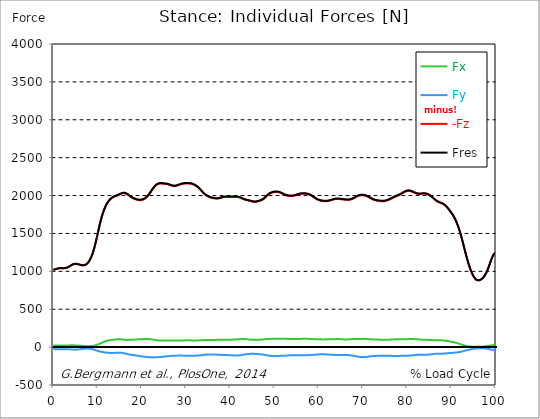
| Category |  Fx |  Fy |  -Fz |  Fres |
|---|---|---|---|---|
| 0.0 | 21.63 | -25.8 | 1021.29 | 1021.92 |
| 0.167348456675344 | 21.66 | -26.13 | 1022.79 | 1023.43 |
| 0.334696913350688 | 21.7 | -26.58 | 1024.83 | 1025.47 |
| 0.5020453700260321 | 21.77 | -27.16 | 1027.46 | 1028.12 |
| 0.669393826701376 | 21.85 | -27.84 | 1030.63 | 1031.31 |
| 0.83674228337672 | 21.93 | -28.56 | 1034.21 | 1034.91 |
| 1.0040907400520642 | 22 | -29.17 | 1037.46 | 1038.18 |
| 1.1621420602454444 | 22.04 | -29.54 | 1039.81 | 1040.54 |
| 1.3294905169207885 | 22.06 | -29.68 | 1041.31 | 1042.05 |
| 1.4968389735961325 | 22.04 | -29.63 | 1042.07 | 1042.8 |
| 1.6641874302714765 | 22 | -29.42 | 1042.23 | 1042.95 |
| 1.8315358869468206 | 21.93 | -29.1 | 1041.96 | 1042.67 |
| 1.9988843436221646 | 21.84 | -28.69 | 1041.45 | 1042.15 |
| 2.1662328002975086 | 21.76 | -28.25 | 1041.04 | 1041.73 |
| 2.333581256972853 | 21.71 | -27.82 | 1041.05 | 1041.74 |
| 2.5009297136481967 | 21.72 | -27.43 | 1041.68 | 1042.36 |
| 2.6682781703235405 | 21.78 | -27.11 | 1043.03 | 1043.7 |
| 2.8356266269988843 | 21.88 | -26.92 | 1045.14 | 1045.81 |
| 3.002975083674229 | 22.04 | -26.91 | 1047.96 | 1048.63 |
| 3.1703235403495724 | 22.25 | -27.13 | 1051.43 | 1052.12 |
| 3.337671997024917 | 22.48 | -27.54 | 1055.49 | 1056.18 |
| 3.4957233172182973 | 22.71 | -28.11 | 1060.13 | 1060.84 |
| 3.663071773893641 | 22.93 | -28.83 | 1065.39 | 1066.12 |
| 3.8304202305689854 | 23.15 | -29.67 | 1071.31 | 1072.06 |
| 3.997768687244329 | 23.38 | -30.61 | 1077.79 | 1078.57 |
| 4.165117143919673 | 23.53 | -31.54 | 1084.15 | 1084.96 |
| 4.332465600595017 | 23.56 | -32.34 | 1089.74 | 1090.57 |
| 4.499814057270361 | 23.47 | -32.94 | 1094.05 | 1094.89 |
| 4.667162513945706 | 23.26 | -33.3 | 1097.01 | 1097.86 |
| 4.834510970621049 | 22.94 | -33.44 | 1098.69 | 1099.54 |
| 5.001859427296393 | 22.52 | -33.35 | 1099.2 | 1100.04 |
| 5.169207883971737 | 22.03 | -33.03 | 1098.68 | 1099.49 |
| 5.336556340647081 | 21.46 | -32.51 | 1097.3 | 1098.09 |
| 5.503904797322425 | 20.86 | -31.79 | 1095.24 | 1096 |
| 5.671253253997769 | 20.23 | -30.89 | 1092.68 | 1093.41 |
| 5.82930457419115 | 19.57 | -29.83 | 1089.82 | 1090.51 |
| 5.996653030866494 | 18.88 | -28.66 | 1086.83 | 1087.48 |
| 6.164001487541838 | 18.15 | -27.44 | 1083.9 | 1084.51 |
| 6.331349944217181 | 17.39 | -26.19 | 1081.38 | 1081.95 |
| 6.498698400892526 | 16.64 | -24.95 | 1079.59 | 1080.12 |
| 6.66604685756787 | 15.89 | -23.76 | 1078.83 | 1079.32 |
| 6.833395314243213 | 15.17 | -22.63 | 1079.2 | 1079.66 |
| 7.000743770918558 | 14.49 | -21.6 | 1080.83 | 1081.26 |
| 7.168092227593902 | 13.89 | -20.75 | 1083.97 | 1084.38 |
| 7.335440684269246 | 13.37 | -20.1 | 1088.76 | 1089.15 |
| 7.50278914094459 | 12.95 | -19.69 | 1095.33 | 1095.71 |
| 7.6701375976199335 | 12.67 | -19.55 | 1103.87 | 1104.24 |
| 7.837486054295278 | 12.51 | -19.7 | 1114.48 | 1114.86 |
| 7.995537374488658 | 12.51 | -20.16 | 1127.26 | 1127.65 |
| 8.162885831164003 | 12.66 | -20.93 | 1142.34 | 1142.75 |
| 8.330234287839346 | 13.02 | -22.08 | 1159.97 | 1160.41 |
| 8.49758274451469 | 13.6 | -23.61 | 1180.3 | 1180.78 |
| 8.664931201190035 | 14.46 | -25.48 | 1203.41 | 1203.93 |
| 8.832279657865378 | 15.63 | -27.68 | 1229.36 | 1229.95 |
| 8.999628114540721 | 17.14 | -30.17 | 1258.19 | 1258.86 |
| 9.166976571216066 | 19.01 | -32.94 | 1290.03 | 1290.79 |
| 9.334325027891412 | 21.25 | -35.97 | 1325.11 | 1325.97 |
| 9.501673484566755 | 23.85 | -39.21 | 1363.34 | 1364.33 |
| 9.669021941242098 | 26.75 | -42.54 | 1404.23 | 1405.35 |
| 9.836370397917442 | 29.94 | -45.86 | 1447.05 | 1448.3 |
| 10.003718854592787 | 33.37 | -49.05 | 1490.9 | 1492.3 |
| 10.17106731126813 | 37.01 | -52.05 | 1534.81 | 1536.35 |
| 10.329118631461512 | 40.87 | -54.84 | 1578.02 | 1579.72 |
| 10.496467088136853 | 44.93 | -57.42 | 1619.72 | 1621.57 |
| 10.663815544812199 | 49.11 | -59.78 | 1659.08 | 1661.09 |
| 10.831164001487544 | 53.43 | -61.96 | 1695.86 | 1698.03 |
| 10.998512458162887 | 57.81 | -64 | 1729.85 | 1732.19 |
| 11.16586091483823 | 62.21 | -65.87 | 1761.02 | 1763.54 |
| 11.333209371513574 | 66.55 | -67.56 | 1789.52 | 1792.21 |
| 11.50055782818892 | 70.72 | -69.04 | 1815.5 | 1818.36 |
| 11.667906284864264 | 74.67 | -70.34 | 1839.12 | 1842.14 |
| 11.835254741539607 | 78.28 | -71.5 | 1860.61 | 1863.8 |
| 12.00260319821495 | 81.49 | -72.56 | 1879.99 | 1883.32 |
| 12.169951654890292 | 84.33 | -73.54 | 1897.31 | 1900.76 |
| 12.337300111565641 | 86.82 | -74.45 | 1912.64 | 1916.22 |
| 12.504648568240984 | 88.99 | -75.27 | 1926.14 | 1929.84 |
| 12.662699888434362 | 90.88 | -75.95 | 1938.01 | 1941.8 |
| 12.830048345109708 | 92.45 | -76.43 | 1948.44 | 1952.32 |
| 12.997396801785053 | 93.74 | -76.77 | 1957.64 | 1961.59 |
| 13.164745258460396 | 94.87 | -77.07 | 1965.69 | 1969.7 |
| 13.33209371513574 | 95.88 | -77.22 | 1972.64 | 1976.7 |
| 13.499442171811083 | 96.84 | -77.18 | 1978.57 | 1982.67 |
| 13.666790628486426 | 97.86 | -76.89 | 1983.54 | 1987.68 |
| 13.834139085161771 | 99.02 | -76.33 | 1987.69 | 1991.86 |
| 14.001487541837117 | 100.33 | -75.55 | 1991.19 | 1995.4 |
| 14.16883599851246 | 101.68 | -74.65 | 1994.39 | 1998.62 |
| 14.336184455187803 | 102.76 | -73.82 | 1997.86 | 2002.11 |
| 14.503532911863147 | 103.45 | -73.18 | 2001.83 | 2006.08 |
| 14.670881368538492 | 103.75 | -72.79 | 2006.24 | 2010.47 |
| 14.828932688731873 | 103.78 | -72.72 | 2010.9 | 2015.1 |
| 14.996281145407215 | 103.67 | -72.92 | 2015.61 | 2019.8 |
| 15.163629602082558 | 103.38 | -73.31 | 2020.34 | 2024.52 |
| 15.330978058757903 | 102.67 | -73.99 | 2024.95 | 2029.1 |
| 15.498326515433247 | 101.63 | -75.13 | 2028.9 | 2033.04 |
| 15.665674972108594 | 100.38 | -76.71 | 2031.76 | 2035.9 |
| 15.833023428783937 | 99.05 | -78.65 | 2033.2 | 2037.37 |
| 16.00037188545928 | 97.83 | -80.85 | 2033.13 | 2037.33 |
| 16.167720342134626 | 96.79 | -83.25 | 2031.56 | 2035.82 |
| 16.335068798809967 | 96.02 | -85.74 | 2028.55 | 2032.9 |
| 16.502417255485312 | 95.51 | -88.22 | 2024.24 | 2028.69 |
| 16.669765712160658 | 95.27 | -90.59 | 2018.74 | 2023.3 |
| 16.837114168836 | 95.28 | -92.82 | 2012.17 | 2016.85 |
| 17.004462625511344 | 95.48 | -94.94 | 2004.87 | 2009.68 |
| 17.16251394570472 | 95.79 | -96.98 | 1997.36 | 2002.31 |
| 17.32986240238007 | 96.15 | -98.93 | 1990.07 | 1995.16 |
| 17.497210859055414 | 96.57 | -100.75 | 1983.11 | 1988.33 |
| 17.664559315730756 | 97.06 | -102.38 | 1976.64 | 1981.98 |
| 17.8319077724061 | 97.59 | -103.81 | 1970.78 | 1976.25 |
| 17.999256229081443 | 98.1 | -105.04 | 1965.56 | 1971.13 |
| 18.166604685756788 | 98.55 | -106.18 | 1960.89 | 1966.56 |
| 18.333953142432133 | 98.99 | -107.36 | 1956.66 | 1962.42 |
| 18.501301599107478 | 99.51 | -108.63 | 1952.78 | 1958.64 |
| 18.668650055782823 | 100.1 | -110.03 | 1949.21 | 1955.2 |
| 18.835998512458165 | 100.74 | -111.48 | 1946.02 | 1952.13 |
| 19.00334696913351 | 101.4 | -112.98 | 1943.27 | 1949.5 |
| 19.170695425808855 | 102.06 | -114.6 | 1941.08 | 1947.45 |
| 19.338043882484197 | 102.71 | -116.32 | 1939.56 | 1946.06 |
| 19.496095202677576 | 103.29 | -118.13 | 1938.79 | 1945.43 |
| 19.66344365935292 | 103.78 | -119.94 | 1938.78 | 1945.55 |
| 19.830792116028263 | 104.25 | -121.6 | 1939.56 | 1946.45 |
| 19.998140572703612 | 104.72 | -122.97 | 1941.23 | 1948.22 |
| 20.165489029378953 | 105.13 | -124.1 | 1943.77 | 1950.83 |
| 20.3328374860543 | 105.5 | -125.16 | 1947.25 | 1954.39 |
| 20.500185942729644 | 105.83 | -126.26 | 1951.82 | 1959.02 |
| 20.667534399404985 | 106.11 | -127.44 | 1957.51 | 1964.78 |
| 20.83488285608033 | 106.39 | -128.68 | 1964.29 | 1971.63 |
| 21.002231312755672 | 106.65 | -129.91 | 1972.13 | 1979.53 |
| 21.16957976943102 | 106.75 | -130.95 | 1981.1 | 1988.53 |
| 21.336928226106362 | 106.59 | -131.73 | 1991.36 | 1998.79 |
| 21.504276682781704 | 106.16 | -132.28 | 2002.92 | 2010.33 |
| 21.67162513945705 | 105.52 | -132.72 | 2015.71 | 2023.06 |
| 21.82967645965043 | 104.71 | -133.06 | 2029.58 | 2036.86 |
| 21.997024916325774 | 103.7 | -133.29 | 2044.23 | 2051.42 |
| 22.16437337300112 | 102.52 | -133.42 | 2059.3 | 2066.41 |
| 22.33172182967646 | 101.15 | -133.47 | 2074.31 | 2081.31 |
| 22.499070286351806 | 99.55 | -133.43 | 2088.69 | 2095.57 |
| 22.666418743027148 | 97.83 | -133.34 | 2102.06 | 2108.82 |
| 22.833767199702496 | 96.06 | -133.24 | 2114.16 | 2120.79 |
| 23.00111565637784 | 94.3 | -133.16 | 2124.84 | 2131.35 |
| 23.168464113053183 | 92.57 | -133.09 | 2134.03 | 2140.43 |
| 23.335812569728528 | 91.05 | -132.98 | 2141.71 | 2148.01 |
| 23.50316102640387 | 89.78 | -132.79 | 2147.86 | 2154.07 |
| 23.670509483079215 | 88.79 | -132.47 | 2152.52 | 2158.65 |
| 23.83785793975456 | 88.09 | -132 | 2155.82 | 2161.88 |
| 23.995909259947936 | 87.59 | -131.43 | 2157.92 | 2163.91 |
| 24.163257716623285 | 87.29 | -130.77 | 2158.96 | 2164.89 |
| 24.330606173298627 | 87.12 | -130.04 | 2159.18 | 2165.06 |
| 24.49795462997397 | 87.03 | -129.22 | 2158.8 | 2164.62 |
| 24.665303086649313 | 86.99 | -128.27 | 2157.93 | 2163.69 |
| 24.83265154332466 | 86.94 | -127.23 | 2156.83 | 2162.53 |
| 25.0 | 86.85 | -126.07 | 2155.75 | 2161.38 |
| 25.167348456675345 | 86.76 | -124.88 | 2154.78 | 2160.33 |
| 25.334696913350694 | 86.74 | -123.71 | 2154.02 | 2159.51 |
| 25.502045370026035 | 86.77 | -122.57 | 2153.14 | 2158.56 |
| 25.669393826701377 | 86.82 | -121.52 | 2151.64 | 2157 |
| 25.836742283376722 | 86.84 | -120.57 | 2149.4 | 2154.71 |
| 26.004090740052067 | 86.85 | -119.67 | 2146.69 | 2151.96 |
| 26.17143919672741 | 86.95 | -118.8 | 2143.64 | 2148.87 |
| 26.329490516920792 | 87.16 | -117.9 | 2140.22 | 2145.42 |
| 26.49683897359613 | 87.39 | -116.98 | 2136.65 | 2141.81 |
| 26.66418743027148 | 87.57 | -115.98 | 2133.12 | 2138.24 |
| 26.831535886946828 | 87.67 | -115.01 | 2129.95 | 2135.03 |
| 26.998884343622166 | 87.64 | -114.19 | 2127.53 | 2132.57 |
| 27.166232800297514 | 87.54 | -113.56 | 2125.97 | 2130.97 |
| 27.333581256972852 | 87.42 | -113.12 | 2125.37 | 2130.34 |
| 27.5009297136482 | 87.37 | -112.82 | 2125.75 | 2130.69 |
| 27.668278170323543 | 87.43 | -112.63 | 2127.13 | 2132.06 |
| 27.835626626998888 | 87.52 | -112.49 | 2129.39 | 2134.3 |
| 28.002975083674233 | 87.61 | -112.35 | 2132.42 | 2137.31 |
| 28.170323540349575 | 87.7 | -112.17 | 2135.93 | 2140.8 |
| 28.33767199702492 | 87.79 | -111.93 | 2139.62 | 2144.46 |
| 28.50502045370026 | 87.83 | -111.73 | 2143.03 | 2147.86 |
| 28.663071773893645 | 87.81 | -111.63 | 2145.99 | 2150.8 |
| 28.830420230568986 | 87.84 | -111.63 | 2148.73 | 2153.53 |
| 28.99776868724433 | 87.89 | -111.78 | 2151.5 | 2156.31 |
| 29.165117143919673 | 87.97 | -112.1 | 2154.23 | 2159.05 |
| 29.33246560059502 | 88.12 | -112.44 | 2156.57 | 2161.41 |
| 29.499814057270367 | 88.37 | -112.7 | 2158.22 | 2163.09 |
| 29.66716251394571 | 88.81 | -112.88 | 2159.25 | 2164.14 |
| 29.834510970621054 | 89.36 | -112.91 | 2159.71 | 2164.64 |
| 30.00185942729639 | 89.9 | -112.88 | 2159.79 | 2164.75 |
| 30.169207883971744 | 90.36 | -112.87 | 2159.63 | 2164.62 |
| 30.33655634064708 | 90.63 | -112.89 | 2159.41 | 2164.41 |
| 30.50390479732243 | 90.61 | -112.93 | 2159.27 | 2164.27 |
| 30.671253253997772 | 90.31 | -112.95 | 2159.18 | 2164.17 |
| 30.829304574191156 | 89.77 | -112.95 | 2158.94 | 2163.9 |
| 30.996653030866494 | 89.23 | -112.96 | 2158.08 | 2163 |
| 31.164001487541842 | 88.75 | -112.97 | 2156.4 | 2161.31 |
| 31.331349944217187 | 88.35 | -112.98 | 2153.95 | 2158.85 |
| 31.498698400892525 | 88 | -112.96 | 2150.79 | 2155.67 |
| 31.666046857567874 | 87.74 | -112.92 | 2146.95 | 2151.81 |
| 31.833395314243212 | 87.58 | -112.83 | 2142.44 | 2147.3 |
| 32.00074377091856 | 87.55 | -112.68 | 2137.27 | 2142.13 |
| 32.1680922275939 | 87.63 | -112.47 | 2131.46 | 2136.32 |
| 32.33544068426925 | 87.81 | -112.21 | 2125.05 | 2129.92 |
| 32.50278914094459 | 88.06 | -111.9 | 2118.08 | 2122.94 |
| 32.670137597619934 | 88.36 | -111.5 | 2110.5 | 2115.37 |
| 32.83748605429528 | 88.75 | -110.95 | 2102.17 | 2107.04 |
| 33.004834510970625 | 89.22 | -110.2 | 2092.93 | 2097.8 |
| 33.162885831164004 | 89.76 | -109.25 | 2082.85 | 2087.72 |
| 33.33023428783935 | 90.35 | -108.12 | 2072.03 | 2076.88 |
| 33.497582744514695 | 90.96 | -106.85 | 2060.65 | 2065.49 |
| 33.664931201190036 | 91.56 | -105.45 | 2049.33 | 2054.15 |
| 33.83227965786538 | 92.12 | -104 | 2038.61 | 2043.41 |
| 33.99962811454073 | 92.6 | -102.58 | 2028.69 | 2033.46 |
| 34.16697657121607 | 92.97 | -101.31 | 2019.73 | 2024.47 |
| 34.33432502789141 | 93.2 | -100.28 | 2011.78 | 2016.5 |
| 34.50167348456676 | 93.26 | -99.56 | 2004.81 | 2009.51 |
| 34.6690219412421 | 93.19 | -98.95 | 1998.52 | 2003.21 |
| 34.83637039791744 | 93.05 | -98.4 | 1992.79 | 1997.46 |
| 35.00371885459279 | 92.85 | -97.93 | 1987.64 | 1992.3 |
| 35.17106731126814 | 92.64 | -97.55 | 1983.04 | 1987.68 |
| 35.338415767943474 | 92.49 | -97.28 | 1978.97 | 1983.6 |
| 35.49646708813686 | 92.39 | -97.08 | 1975.48 | 1980.11 |
| 35.6638155448122 | 92.31 | -96.92 | 1972.53 | 1977.15 |
| 35.831164001487544 | 92.23 | -96.84 | 1970.05 | 1974.67 |
| 35.998512458162885 | 92.21 | -96.91 | 1967.92 | 1972.55 |
| 36.165860914838234 | 92.36 | -97.16 | 1965.92 | 1970.57 |
| 36.333209371513576 | 92.72 | -97.48 | 1963.98 | 1968.67 |
| 36.50055782818892 | 93.29 | -97.87 | 1962.19 | 1966.94 |
| 36.667906284864266 | 94.05 | -98.37 | 1960.75 | 1965.56 |
| 36.83525474153961 | 94.89 | -98.94 | 1959.81 | 1964.7 |
| 37.002603198214956 | 95.69 | -99.5 | 1959.61 | 1964.56 |
| 37.1699516548903 | 96.38 | -100.04 | 1960.23 | 1965.25 |
| 37.337300111565646 | 96.88 | -100.58 | 1961.68 | 1966.75 |
| 37.50464856824098 | 97.19 | -101.11 | 1963.83 | 1968.94 |
| 37.66269988843437 | 97.28 | -101.65 | 1966.47 | 1971.61 |
| 37.83004834510971 | 97.2 | -102.19 | 1969.37 | 1974.52 |
| 37.99739680178505 | 97 | -102.71 | 1972.29 | 1977.44 |
| 38.16474525846039 | 96.72 | -103.15 | 1974.98 | 1980.14 |
| 38.33209371513574 | 96.42 | -103.56 | 1977.38 | 1982.53 |
| 38.49944217181109 | 96.13 | -103.91 | 1979.29 | 1984.44 |
| 38.666790628486424 | 95.89 | -104.23 | 1980.59 | 1985.74 |
| 38.83413908516178 | 95.7 | -104.48 | 1981.27 | 1986.42 |
| 39.001487541837115 | 95.57 | -104.66 | 1981.39 | 1986.54 |
| 39.16883599851246 | 95.5 | -104.83 | 1981.2 | 1986.35 |
| 39.336184455187805 | 95.52 | -105.04 | 1981.06 | 1986.23 |
| 39.503532911863154 | 95.62 | -105.32 | 1981.11 | 1986.29 |
| 39.670881368538495 | 95.84 | -105.67 | 1981.29 | 1986.5 |
| 39.83822982521384 | 96.19 | -106.1 | 1981.56 | 1986.81 |
| 39.996281145407224 | 96.67 | -106.62 | 1981.79 | 1987.09 |
| 40.163629602082565 | 97.28 | -107.21 | 1981.88 | 1987.25 |
| 40.33097805875791 | 97.94 | -107.85 | 1981.89 | 1987.33 |
| 40.498326515433256 | 98.59 | -108.46 | 1981.89 | 1987.4 |
| 40.6656749721086 | 99.21 | -109.01 | 1981.99 | 1987.58 |
| 40.83302342878393 | 99.79 | -109.51 | 1982.27 | 1987.91 |
| 41.00037188545929 | 100.33 | -109.94 | 1982.62 | 1988.31 |
| 41.16772034213463 | 100.88 | -110.31 | 1982.81 | 1988.55 |
| 41.33506879880997 | 101.48 | -110.54 | 1982.58 | 1988.37 |
| 41.50241725548531 | 102.12 | -110.6 | 1981.82 | 1987.65 |
| 41.66976571216066 | 102.79 | -110.44 | 1980.48 | 1986.34 |
| 41.837114168836 | 103.45 | -110.03 | 1978.57 | 1984.44 |
| 42.004462625511344 | 104.09 | -109.34 | 1976.07 | 1981.95 |
| 42.17181108218669 | 104.69 | -108.37 | 1973.01 | 1978.88 |
| 42.32986240238007 | 105.27 | -107.16 | 1969.43 | 1975.28 |
| 42.497210859055414 | 105.78 | -105.67 | 1965.32 | 1971.14 |
| 42.66455931573076 | 106.15 | -103.93 | 1960.85 | 1966.61 |
| 42.831907772406105 | 106.36 | -102.02 | 1956.33 | 1962.02 |
| 42.999256229081446 | 106.38 | -100.01 | 1952.12 | 1957.72 |
| 43.16660468575679 | 106.18 | -98.01 | 1948.37 | 1953.88 |
| 43.33395314243214 | 105.74 | -96.13 | 1945.11 | 1950.51 |
| 43.50130159910748 | 105.04 | -94.42 | 1942.36 | 1947.64 |
| 43.66865005578282 | 104.13 | -92.95 | 1939.97 | 1945.14 |
| 43.83599851245817 | 103.13 | -91.73 | 1937.82 | 1942.88 |
| 44.00334696913351 | 102.12 | -90.84 | 1935.83 | 1940.79 |
| 44.17069542580886 | 101.14 | -90.18 | 1933.81 | 1938.68 |
| 44.3380438824842 | 100.21 | -89.7 | 1931.58 | 1936.37 |
| 44.49609520267758 | 99.34 | -89.33 | 1929.07 | 1933.79 |
| 44.66344365935292 | 98.51 | -89.04 | 1926.3 | 1930.98 |
| 44.83079211602827 | 97.8 | -88.81 | 1923.47 | 1928.09 |
| 44.99814057270361 | 97.21 | -88.65 | 1920.9 | 1925.48 |
| 45.16548902937895 | 96.75 | -88.64 | 1918.94 | 1923.5 |
| 45.332837486054295 | 96.41 | -88.77 | 1917.69 | 1922.25 |
| 45.500185942729644 | 96.21 | -89.06 | 1917.21 | 1921.76 |
| 45.66753439940499 | 96.12 | -89.49 | 1917.42 | 1921.98 |
| 45.83488285608033 | 96.16 | -90.02 | 1918.32 | 1922.91 |
| 46.00223131275568 | 96.29 | -90.64 | 1919.85 | 1924.48 |
| 46.16957976943102 | 96.49 | -91.33 | 1922 | 1926.66 |
| 46.336928226106366 | 96.78 | -92.05 | 1924.66 | 1929.36 |
| 46.50427668278171 | 97.2 | -92.81 | 1927.58 | 1932.34 |
| 46.671625139457056 | 97.74 | -93.63 | 1930.64 | 1935.45 |
| 46.829676459650436 | 98.39 | -94.56 | 1933.86 | 1938.73 |
| 46.99702491632577 | 99.05 | -95.62 | 1937.45 | 1942.4 |
| 47.16437337300112 | 99.78 | -96.84 | 1941.68 | 1946.73 |
| 47.33172182967646 | 100.62 | -98.24 | 1946.91 | 1952.05 |
| 47.49907028635181 | 101.53 | -99.8 | 1953.31 | 1958.57 |
| 47.66641874302716 | 102.52 | -101.53 | 1960.99 | 1966.37 |
| 47.83376719970249 | 103.59 | -103.5 | 1970 | 1975.51 |
| 48.001115656377834 | 104.74 | -105.57 | 1979.95 | 1985.61 |
| 48.16846411305319 | 105.81 | -107.53 | 1990 | 1995.79 |
| 48.33581256972853 | 106.69 | -109.32 | 1999.43 | 2005.35 |
| 48.50316102640387 | 107.36 | -110.99 | 2008.03 | 2014.05 |
| 48.67050948307921 | 107.82 | -112.55 | 2015.67 | 2021.78 |
| 48.837857939754564 | 108.11 | -113.94 | 2022.36 | 2028.55 |
| 49.005206396429905 | 108.35 | -115.22 | 2028.09 | 2034.35 |
| 49.163257716623285 | 108.58 | -116.37 | 2032.85 | 2039.19 |
| 49.33060617329863 | 108.82 | -117.35 | 2036.75 | 2043.15 |
| 49.49795462997397 | 109.05 | -118.12 | 2039.88 | 2046.33 |
| 49.66530308664932 | 109.27 | -118.65 | 2042.33 | 2048.82 |
| 49.832651543324666 | 109.46 | -118.93 | 2044.19 | 2050.72 |
| 50.0 | 109.59 | -118.98 | 2045.58 | 2052.11 |
| 50.16734845667534 | 109.61 | -118.78 | 2046.56 | 2053.09 |
| 50.33469691335069 | 109.5 | -118.38 | 2047.16 | 2053.66 |
| 50.50204537002604 | 109.28 | -117.81 | 2047.34 | 2053.8 |
| 50.66939382670139 | 109.05 | -117.16 | 2046.91 | 2053.32 |
| 50.836742283376715 | 108.92 | -116.5 | 2045.58 | 2051.95 |
| 51.00409074005207 | 108.89 | -115.87 | 2043.32 | 2049.66 |
| 51.17143919672741 | 108.94 | -115.29 | 2040.11 | 2046.43 |
| 51.32949051692079 | 109.02 | -114.8 | 2036.21 | 2042.52 |
| 51.496838973596134 | 109.12 | -114.46 | 2032.03 | 2038.34 |
| 51.66418743027148 | 109.25 | -114.2 | 2027.6 | 2033.91 |
| 51.831535886946824 | 109.33 | -113.93 | 2022.94 | 2029.25 |
| 51.99888434362217 | 109.35 | -113.65 | 2018.15 | 2024.47 |
| 52.16623280029752 | 109.28 | -113.35 | 2013.39 | 2019.7 |
| 52.33358125697285 | 109.2 | -113.03 | 2008.9 | 2015.2 |
| 52.5009297136482 | 109.12 | -112.65 | 2004.9 | 2011.18 |
| 52.668278170323546 | 108.98 | -112.14 | 2001.52 | 2007.77 |
| 52.835626626998895 | 108.7 | -111.43 | 1998.92 | 2005.13 |
| 53.00297508367424 | 108.36 | -110.64 | 1996.9 | 2003.06 |
| 53.17032354034958 | 107.98 | -109.81 | 1995.37 | 2001.47 |
| 53.33767199702492 | 107.6 | -108.96 | 1994.39 | 2000.43 |
| 53.50502045370027 | 107.33 | -108.13 | 1993.85 | 1999.83 |
| 53.663071773893655 | 107.19 | -107.39 | 1993.64 | 1999.58 |
| 53.83042023056899 | 107.18 | -106.82 | 1993.76 | 1999.67 |
| 53.99776868724433 | 107.22 | -106.49 | 1994.27 | 2000.16 |
| 54.16511714391967 | 107.23 | -106.42 | 1995.24 | 2001.12 |
| 54.33246560059503 | 107.17 | -106.5 | 1996.72 | 2002.59 |
| 54.49981405727037 | 107.03 | -106.64 | 1998.77 | 2004.64 |
| 54.667162513945705 | 106.88 | -106.84 | 2001.38 | 2007.24 |
| 54.834510970621054 | 106.7 | -107.02 | 2004.52 | 2010.37 |
| 55.0018594272964 | 106.54 | -107.14 | 2008.1 | 2013.94 |
| 55.169207883971744 | 106.44 | -107.22 | 2011.87 | 2017.7 |
| 55.336556340647086 | 106.43 | -107.28 | 2015.33 | 2021.14 |
| 55.50390479732243 | 106.56 | -107.4 | 2018.16 | 2023.98 |
| 55.671253253997776 | 106.9 | -107.6 | 2020.34 | 2026.19 |
| 55.83860171067312 | 107.39 | -107.87 | 2021.89 | 2027.78 |
| 55.9966530308665 | 108.08 | -108.23 | 2022.9 | 2028.85 |
| 56.16400148754184 | 108.84 | -108.55 | 2023.5 | 2029.51 |
| 56.33134994421718 | 109.52 | -108.7 | 2023.77 | 2029.83 |
| 56.498698400892536 | 110.07 | -108.72 | 2023.83 | 2029.93 |
| 56.66604685756788 | 110.42 | -108.62 | 2023.87 | 2029.98 |
| 56.83339531424321 | 110.54 | -108.42 | 2023.76 | 2029.87 |
| 57.00074377091856 | 110.49 | -108.14 | 2023.39 | 2029.49 |
| 57.16809222759391 | 110.31 | -107.78 | 2022.65 | 2028.72 |
| 57.33544068426925 | 109.97 | -107.34 | 2021.32 | 2027.36 |
| 57.5027891409446 | 109.48 | -106.83 | 2019.27 | 2025.25 |
| 57.670137597619934 | 108.89 | -106.29 | 2016.44 | 2022.38 |
| 57.83748605429528 | 108.25 | -105.77 | 2012.93 | 2018.81 |
| 58.004834510970625 | 107.59 | -105.24 | 2008.8 | 2014.63 |
| 58.16288583116401 | 106.96 | -104.62 | 2004.08 | 2009.86 |
| 58.330234287839346 | 106.38 | -103.96 | 1998.8 | 2004.52 |
| 58.497582744514695 | 105.89 | -103.31 | 1992.93 | 1998.61 |
| 58.66493120119004 | 105.48 | -102.69 | 1986.5 | 1992.14 |
| 58.832279657865385 | 105.22 | -102.1 | 1979.66 | 1985.28 |
| 58.999628114540734 | 105.06 | -101.42 | 1972.86 | 1978.45 |
| 59.16697657121607 | 104.9 | -100.59 | 1966.25 | 1971.81 |
| 59.33432502789142 | 104.74 | -99.66 | 1959.91 | 1965.43 |
| 59.50167348456676 | 104.55 | -98.68 | 1954.02 | 1959.5 |
| 59.66902194124211 | 104.27 | -97.68 | 1948.74 | 1954.17 |
| 59.83637039791745 | 103.94 | -96.7 | 1944.09 | 1949.46 |
| 60.00371885459278 | 103.58 | -95.78 | 1940.07 | 1945.38 |
| 60.17106731126813 | 103.19 | -94.94 | 1936.64 | 1941.9 |
| 60.33841576794349 | 102.8 | -94.2 | 1933.78 | 1938.99 |
| 60.49646708813685 | 102.44 | -93.61 | 1931.52 | 1936.7 |
| 60.6638155448122 | 102.14 | -93.22 | 1929.88 | 1935.02 |
| 60.831164001487544 | 101.91 | -93.09 | 1928.75 | 1933.88 |
| 60.99851245816289 | 101.81 | -93.2 | 1927.85 | 1932.98 |
| 61.16586091483824 | 101.88 | -93.55 | 1926.98 | 1932.14 |
| 61.333209371513576 | 102.17 | -94.12 | 1926.26 | 1931.46 |
| 61.50055782818892 | 102.66 | -94.9 | 1925.81 | 1931.08 |
| 61.667906284864266 | 103.3 | -95.82 | 1925.77 | 1931.13 |
| 61.835254741539615 | 103.96 | -96.76 | 1926.25 | 1931.7 |
| 62.002603198214956 | 104.52 | -97.64 | 1927.35 | 1932.87 |
| 62.16995165489029 | 104.92 | -98.37 | 1929.03 | 1934.61 |
| 62.33730011156564 | 105.17 | -98.99 | 1931.16 | 1936.78 |
| 62.504648568240995 | 105.29 | -99.59 | 1933.61 | 1939.25 |
| 62.67199702491633 | 105.3 | -100.22 | 1936.25 | 1941.93 |
| 62.83004834510971 | 105.21 | -100.86 | 1939.03 | 1944.72 |
| 62.99739680178505 | 105.06 | -101.46 | 1941.92 | 1947.63 |
| 63.1647452584604 | 104.94 | -102.05 | 1944.83 | 1950.55 |
| 63.33209371513575 | 104.88 | -102.6 | 1947.69 | 1953.42 |
| 63.4994421718111 | 104.93 | -103.08 | 1950.37 | 1956.11 |
| 63.666790628486424 | 105.1 | -103.46 | 1952.73 | 1958.5 |
| 63.83413908516177 | 105.31 | -103.77 | 1954.55 | 1960.33 |
| 64.00148754183712 | 105.49 | -104.02 | 1955.7 | 1961.5 |
| 64.16883599851248 | 105.63 | -104.23 | 1956.19 | 1962 |
| 64.3361844551878 | 105.73 | -104.38 | 1956.08 | 1961.9 |
| 64.50353291186315 | 105.74 | -104.45 | 1955.45 | 1961.28 |
| 64.6708813685385 | 105.61 | -104.36 | 1954.38 | 1960.2 |
| 64.83822982521384 | 105.33 | -104.13 | 1953.03 | 1958.82 |
| 65.00557828188919 | 104.87 | -103.77 | 1951.59 | 1957.34 |
| 65.16362960208257 | 104.26 | -103.37 | 1950.24 | 1955.94 |
| 65.3309780587579 | 103.54 | -102.97 | 1949 | 1954.65 |
| 65.49832651543326 | 102.75 | -102.65 | 1947.96 | 1953.55 |
| 65.6656749721086 | 102.01 | -102.52 | 1947.08 | 1952.63 |
| 65.83302342878395 | 101.49 | -102.64 | 1946.26 | 1951.79 |
| 66.00037188545929 | 101.18 | -102.91 | 1945.46 | 1950.99 |
| 66.16772034213463 | 101.1 | -103.27 | 1944.67 | 1950.22 |
| 66.33506879880998 | 101.33 | -103.82 | 1943.94 | 1949.54 |
| 66.50241725548531 | 101.84 | -104.54 | 1943.36 | 1949.03 |
| 66.66976571216065 | 102.52 | -105.4 | 1943.17 | 1948.92 |
| 66.83711416883601 | 103.27 | -106.35 | 1943.64 | 1949.48 |
| 67.00446262551135 | 103.95 | -107.35 | 1944.94 | 1950.86 |
| 67.1718110821867 | 104.53 | -108.42 | 1947.04 | 1953.04 |
| 67.32986240238007 | 105.01 | -109.57 | 1949.8 | 1955.88 |
| 67.49721085905541 | 105.39 | -110.83 | 1953.12 | 1959.28 |
| 67.66455931573076 | 105.67 | -112.18 | 1956.95 | 1963.19 |
| 67.83190777240611 | 105.86 | -113.63 | 1961.33 | 1967.64 |
| 67.99925622908145 | 105.96 | -115.22 | 1966.26 | 1972.65 |
| 68.16660468575678 | 106.01 | -117.01 | 1971.72 | 1978.18 |
| 68.33395314243214 | 106.1 | -119.02 | 1977.32 | 1983.88 |
| 68.50130159910749 | 106.27 | -121.28 | 1983 | 1989.69 |
| 68.66865005578282 | 106.5 | -123.57 | 1988.44 | 1995.25 |
| 68.83599851245816 | 106.74 | -125.55 | 1993.08 | 2000 |
| 69.00334696913352 | 107.01 | -127.17 | 1996.8 | 2003.82 |
| 69.17069542580886 | 107.32 | -128.49 | 1999.68 | 2006.8 |
| 69.3380438824842 | 107.67 | -129.53 | 2001.83 | 2009.03 |
| 69.50539233915956 | 108.04 | -130.32 | 2003.26 | 2010.53 |
| 69.66344365935292 | 108.4 | -130.91 | 2003.99 | 2011.32 |
| 69.83079211602826 | 108.7 | -131.3 | 2004.05 | 2011.43 |
| 69.99814057270362 | 108.92 | -131.51 | 2003.52 | 2010.93 |
| 70.16548902937896 | 108.97 | -131.57 | 2002.58 | 2010 |
| 70.33283748605429 | 108.88 | -131.43 | 2001.09 | 2008.51 |
| 70.50018594272964 | 108.66 | -131.01 | 1998.9 | 2006.29 |
| 70.667534399405 | 108.27 | -130.29 | 1995.98 | 2003.32 |
| 70.83488285608033 | 107.74 | -129.28 | 1992.4 | 1999.66 |
| 71.00223131275568 | 107.06 | -128.02 | 1988.16 | 1995.33 |
| 71.16957976943102 | 106.29 | -126.56 | 1983.29 | 1990.35 |
| 71.33692822610637 | 105.44 | -124.95 | 1977.78 | 1984.71 |
| 71.50427668278171 | 104.62 | -123.41 | 1971.89 | 1978.72 |
| 71.67162513945706 | 103.86 | -122.06 | 1965.98 | 1972.71 |
| 71.8389735961324 | 103.17 | -120.91 | 1960.34 | 1966.98 |
| 71.99702491632577 | 102.6 | -119.92 | 1955.23 | 1961.81 |
| 72.16437337300113 | 102.15 | -119.03 | 1950.65 | 1957.16 |
| 72.33172182967647 | 101.84 | -118.29 | 1946.49 | 1952.96 |
| 72.49907028635181 | 101.6 | -117.65 | 1942.81 | 1949.24 |
| 72.66641874302715 | 101.39 | -117.06 | 1939.67 | 1946.07 |
| 72.8337671997025 | 101.15 | -116.54 | 1937.03 | 1943.39 |
| 73.00111565637783 | 100.87 | -116.06 | 1934.75 | 1941.07 |
| 73.16846411305319 | 100.53 | -115.63 | 1932.74 | 1939.03 |
| 73.33581256972853 | 100.12 | -115.23 | 1930.99 | 1937.24 |
| 73.50316102640387 | 99.64 | -114.86 | 1929.5 | 1935.71 |
| 73.67050948307921 | 99.1 | -114.56 | 1928.29 | 1934.46 |
| 73.83785793975457 | 98.53 | -114.29 | 1927.33 | 1933.46 |
| 74.00520639642991 | 98 | -114.01 | 1926.49 | 1932.59 |
| 74.16325771662328 | 97.61 | -113.75 | 1925.76 | 1931.82 |
| 74.33060617329863 | 97.31 | -113.49 | 1925.24 | 1931.27 |
| 74.49795462997398 | 97.08 | -113.25 | 1925.08 | 1931.09 |
| 74.66530308664932 | 96.87 | -113.01 | 1925.43 | 1931.41 |
| 74.83265154332466 | 96.68 | -112.78 | 1926.37 | 1932.33 |
| 75.00000000000001 | 96.57 | -112.58 | 1927.9 | 1933.84 |
| 75.16734845667534 | 96.57 | -112.43 | 1930 | 1935.92 |
| 75.3346969133507 | 96.66 | -112.38 | 1932.61 | 1938.52 |
| 75.50204537002605 | 96.86 | -112.5 | 1935.76 | 1941.69 |
| 75.66939382670138 | 97.17 | -112.78 | 1939.41 | 1945.36 |
| 75.83674228337672 | 97.6 | -113.2 | 1943.48 | 1949.47 |
| 76.00409074005208 | 98.16 | -113.77 | 1947.94 | 1953.99 |
| 76.17143919672742 | 98.83 | -114.46 | 1952.74 | 1958.85 |
| 76.33878765340276 | 99.54 | -115.23 | 1957.78 | 1963.96 |
| 76.49683897359614 | 100.27 | -116.01 | 1962.9 | 1969.15 |
| 76.66418743027148 | 101 | -116.79 | 1967.95 | 1974.28 |
| 76.83153588694682 | 101.68 | -117.52 | 1972.85 | 1979.24 |
| 76.99888434362218 | 102.29 | -118.16 | 1977.51 | 1983.97 |
| 77.16623280029752 | 102.77 | -118.62 | 1981.9 | 1988.41 |
| 77.33358125697285 | 103.06 | -118.86 | 1985.98 | 1992.52 |
| 77.5009297136482 | 103.22 | -118.85 | 1990 | 1996.55 |
| 77.66827817032356 | 103.27 | -118.58 | 1994.13 | 2000.66 |
| 77.83562662699889 | 103.32 | -118.1 | 1998.33 | 2004.83 |
| 78.00297508367423 | 103.42 | -117.52 | 2002.56 | 2009.02 |
| 78.17032354034959 | 103.52 | -116.81 | 2006.77 | 2013.18 |
| 78.33767199702493 | 103.64 | -116.07 | 2011.18 | 2017.54 |
| 78.50502045370027 | 103.79 | -115.4 | 2015.97 | 2022.28 |
| 78.67236891037561 | 103.97 | -114.95 | 2021.18 | 2027.45 |
| 78.83042023056899 | 104.19 | -114.71 | 2026.73 | 2032.98 |
| 78.99776868724433 | 104.44 | -114.66 | 2032.54 | 2038.78 |
| 79.16511714391969 | 104.63 | -114.77 | 2038.56 | 2044.8 |
| 79.33246560059503 | 104.72 | -114.89 | 2044.47 | 2050.7 |
| 79.49981405727036 | 104.8 | -114.9 | 2049.89 | 2056.1 |
| 79.66716251394571 | 104.94 | -114.71 | 2054.5 | 2060.69 |
| 79.83451097062107 | 105.13 | -114.38 | 2058.16 | 2064.33 |
| 80.00185942729641 | 105.36 | -113.93 | 2060.74 | 2066.89 |
| 80.16920788397174 | 105.6 | -113.4 | 2062.26 | 2068.38 |
| 80.33655634064709 | 105.84 | -112.79 | 2062.61 | 2068.7 |
| 80.50390479732243 | 106.07 | -112.1 | 2061.84 | 2067.9 |
| 80.67125325399778 | 106.28 | -111.31 | 2060.07 | 2066.1 |
| 80.83860171067312 | 106.43 | -110.43 | 2057.43 | 2063.42 |
| 80.99665303086651 | 106.46 | -109.44 | 2054.05 | 2060 |
| 81.16400148754184 | 106.38 | -108.39 | 2050.11 | 2056 |
| 81.3313499442172 | 106.18 | -107.28 | 2045.71 | 2051.54 |
| 81.49869840089255 | 105.83 | -106.14 | 2041 | 2046.77 |
| 81.66604685756786 | 105.41 | -105.06 | 2036.31 | 2042.01 |
| 81.83339531424322 | 104.94 | -104.13 | 2032.05 | 2037.68 |
| 82.00074377091858 | 104.41 | -103.34 | 2028.38 | 2033.95 |
| 82.16809222759392 | 103.81 | -102.68 | 2025.39 | 2030.89 |
| 82.33544068426926 | 103.14 | -102.12 | 2023.07 | 2028.51 |
| 82.50278914094459 | 102.38 | -101.66 | 2021.44 | 2026.81 |
| 82.67013759761994 | 101.57 | -101.28 | 2020.5 | 2025.81 |
| 82.83748605429528 | 100.73 | -101.01 | 2020.23 | 2025.47 |
| 83.00483451097062 | 99.9 | -100.9 | 2020.66 | 2025.84 |
| 83.17218296764597 | 99.14 | -100.96 | 2021.72 | 2026.86 |
| 83.33023428783935 | 98.51 | -101.13 | 2023.32 | 2028.42 |
| 83.4975827445147 | 98.02 | -101.34 | 2025.04 | 2030.12 |
| 83.66493120119004 | 97.65 | -101.49 | 2026.37 | 2031.44 |
| 83.83227965786537 | 97.31 | -101.54 | 2026.71 | 2031.76 |
| 83.99962811454073 | 96.96 | -101.47 | 2026.05 | 2031.08 |
| 84.16697657121607 | 96.58 | -101.23 | 2024.42 | 2029.43 |
| 84.33432502789142 | 96.18 | -100.79 | 2021.89 | 2026.87 |
| 84.50167348456677 | 95.72 | -100.18 | 2018.57 | 2023.5 |
| 84.6690219412421 | 95.2 | -99.43 | 2014.61 | 2019.5 |
| 84.83637039791745 | 94.63 | -98.57 | 2010.14 | 2014.97 |
| 85.0037188545928 | 94.05 | -97.65 | 2005.16 | 2009.93 |
| 85.17106731126813 | 93.53 | -96.64 | 1999.56 | 2004.28 |
| 85.33841576794349 | 93.09 | -95.53 | 1993.23 | 1997.89 |
| 85.50576422461883 | 92.72 | -94.3 | 1986.09 | 1990.7 |
| 85.66381554481221 | 92.43 | -92.99 | 1978.08 | 1982.64 |
| 85.83116400148755 | 92.2 | -91.64 | 1969.16 | 1973.68 |
| 85.99851245816289 | 91.95 | -90.35 | 1959.65 | 1964.14 |
| 86.16586091483823 | 91.58 | -89.27 | 1950.49 | 1954.95 |
| 86.33320937151358 | 91.14 | -88.37 | 1942.13 | 1946.55 |
| 86.50055782818893 | 90.67 | -87.63 | 1934.61 | 1939.01 |
| 86.66790628486427 | 90.2 | -87.05 | 1927.95 | 1932.33 |
| 86.83525474153961 | 89.8 | -86.66 | 1922.13 | 1926.5 |
| 87.00260319821496 | 89.56 | -86.49 | 1917.03 | 1921.39 |
| 87.16995165489031 | 89.48 | -86.47 | 1912.4 | 1916.78 |
| 87.33730011156564 | 89.51 | -86.56 | 1908.14 | 1912.54 |
| 87.504648568241 | 89.54 | -86.67 | 1904.14 | 1908.55 |
| 87.67199702491634 | 89.49 | -86.71 | 1900.26 | 1904.68 |
| 87.83004834510972 | 89.27 | -86.64 | 1896.28 | 1900.69 |
| 87.99739680178506 | 88.73 | -86.4 | 1891.92 | 1896.29 |
| 88.1647452584604 | 87.8 | -85.93 | 1886.89 | 1891.2 |
| 88.33209371513574 | 86.55 | -85.17 | 1880.85 | 1885.07 |
| 88.49944217181108 | 85.1 | -84.23 | 1873.68 | 1877.79 |
| 88.66679062848644 | 83.52 | -83.21 | 1865.34 | 1869.35 |
| 88.83413908516178 | 81.87 | -82.15 | 1855.87 | 1859.76 |
| 89.00148754183712 | 80.23 | -81.14 | 1845.42 | 1849.22 |
| 89.16883599851246 | 78.65 | -80.22 | 1834.16 | 1837.87 |
| 89.33618445518782 | 77.15 | -79.39 | 1822.19 | 1825.81 |
| 89.50353291186315 | 75.73 | -78.71 | 1809.64 | 1813.2 |
| 89.6708813685385 | 74.34 | -78.14 | 1796.63 | 1800.13 |
| 89.83822982521386 | 72.89 | -77.64 | 1783.32 | 1786.76 |
| 90.00557828188919 | 71.28 | -77.02 | 1769.81 | 1773.19 |
| 90.16362960208257 | 69.46 | -76.31 | 1755.89 | 1759.19 |
| 90.3309780587579 | 67.43 | -75.49 | 1741.26 | 1744.48 |
| 90.49832651543326 | 65.25 | -74.58 | 1725.42 | 1728.55 |
| 90.66567497210859 | 62.95 | -73.62 | 1707.93 | 1710.98 |
| 90.83302342878395 | 60.52 | -72.61 | 1688.74 | 1691.71 |
| 91.00037188545929 | 57.96 | -71.57 | 1667.91 | 1670.8 |
| 91.16772034213463 | 55.27 | -70.51 | 1645.43 | 1648.26 |
| 91.33506879880998 | 52.45 | -69.38 | 1621.27 | 1624.02 |
| 91.50241725548533 | 49.51 | -68.09 | 1595.19 | 1597.87 |
| 91.66976571216065 | 46.48 | -66.67 | 1567.26 | 1569.86 |
| 91.83711416883601 | 43.39 | -65.09 | 1537.45 | 1539.97 |
| 92.00446262551137 | 40.23 | -63.29 | 1505.71 | 1508.15 |
| 92.1718110821867 | 37.04 | -61.26 | 1472.05 | 1474.4 |
| 92.33915953886203 | 33.83 | -59.01 | 1436.78 | 1439.03 |
| 92.49721085905541 | 30.65 | -56.56 | 1400.19 | 1402.35 |
| 92.66455931573077 | 27.53 | -53.92 | 1362.48 | 1364.54 |
| 92.83190777240611 | 24.54 | -51.19 | 1324.15 | 1326.12 |
| 92.99925622908145 | 21.71 | -48.47 | 1285.73 | 1287.6 |
| 93.1666046857568 | 19.08 | -45.83 | 1247.75 | 1249.53 |
| 93.33395314243214 | 16.67 | -43.31 | 1210.73 | 1212.42 |
| 93.50130159910749 | 14.49 | -40.9 | 1174.93 | 1176.53 |
| 93.66865005578283 | 12.51 | -38.51 | 1140.44 | 1141.96 |
| 93.83599851245818 | 10.75 | -36.16 | 1107.65 | 1109.08 |
| 94.00334696913353 | 9.22 | -33.89 | 1076.66 | 1078.01 |
| 94.17069542580886 | 7.92 | -31.69 | 1047.63 | 1048.89 |
| 94.3380438824842 | 6.85 | -29.57 | 1020.51 | 1021.69 |
| 94.50539233915954 | 5.99 | -27.58 | 995.66 | 996.76 |
| 94.66344365935292 | 5.32 | -25.7 | 973.08 | 974.11 |
| 94.83079211602828 | 4.8 | -23.94 | 952.7 | 953.66 |
| 94.99814057270362 | 4.43 | -22.35 | 934.59 | 935.49 |
| 95.16548902937897 | 4.18 | -20.88 | 918.81 | 919.65 |
| 95.33283748605432 | 4.05 | -19.54 | 905.6 | 906.4 |
| 95.50018594272963 | 4.01 | -18.35 | 895.22 | 895.97 |
| 95.66753439940499 | 4.06 | -17.34 | 887.66 | 888.37 |
| 95.83488285608034 | 4.2 | -16.49 | 882.8 | 883.48 |
| 96.00223131275567 | 4.41 | -15.8 | 880.48 | 881.13 |
| 96.16957976943102 | 4.66 | -15.27 | 880.52 | 881.15 |
| 96.33692822610638 | 4.96 | -14.87 | 882.49 | 883.11 |
| 96.50427668278171 | 5.28 | -14.59 | 886.01 | 886.61 |
| 96.67162513945706 | 5.64 | -14.46 | 890.75 | 891.35 |
| 96.8389735961324 | 6.06 | -14.53 | 896.88 | 897.47 |
| 96.99702491632577 | 6.61 | -14.82 | 904.92 | 905.51 |
| 97.16437337300111 | 7.28 | -15.32 | 914.97 | 915.56 |
| 97.33172182967647 | 8.08 | -16.03 | 927.12 | 927.71 |
| 97.49907028635181 | 9.01 | -16.94 | 941.37 | 941.98 |
| 97.66641874302715 | 10.08 | -18.06 | 957.71 | 958.34 |
| 97.8337671997025 | 11.28 | -19.37 | 976.07 | 976.72 |
| 98.00111565637785 | 12.61 | -20.87 | 996.48 | 997.16 |
| 98.16846411305319 | 14.07 | -22.54 | 1018.72 | 1019.44 |
| 98.33581256972855 | 15.69 | -24.34 | 1042.98 | 1043.75 |
| 98.50316102640389 | 17.42 | -26.28 | 1068.96 | 1069.79 |
| 98.67050948307921 | 19.22 | -28.31 | 1096.08 | 1096.98 |
| 98.83785793975456 | 21.06 | -30.4 | 1123.71 | 1124.68 |
| 99.0052063964299 | 22.86 | -32.45 | 1150.51 | 1151.55 |
| 99.17255485310525 | 24.52 | -34.36 | 1175.03 | 1176.14 |
| 99.33060617329863 | 26 | -36.08 | 1196.52 | 1197.69 |
| 99.49795462997399 | 27.29 | -37.56 | 1214.69 | 1215.91 |
| 99.66530308664933 | 28.36 | -38.78 | 1229.22 | 1230.49 |
| 99.83265154332467 | 29.1 | -39.65 | 1239.45 | 1240.75 |
| 100.0 | 29.5 | -40.14 | 1245.02 | 1246.34 |